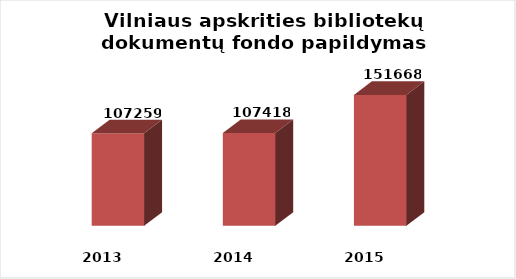
| Category | Series 0 |
|---|---|
| 2013.0 | 107259 |
| 2014.0 | 107418 |
| 2015.0 | 151668 |